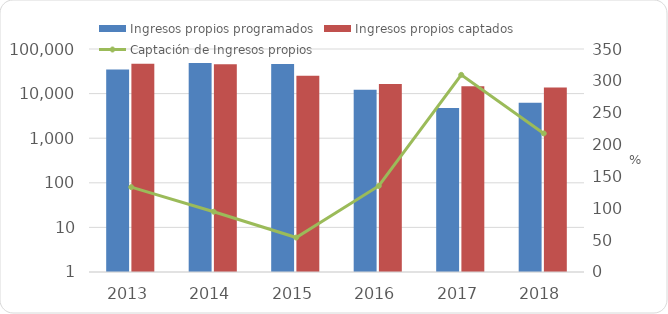
| Category | Ingresos propios programados | Ingresos propios captados  |
|---|---|---|
| 2013 | 34864.059 | 46445.785 |
| 2014 | 48309 | 45688 |
| 2015 | 46290.3 | 25037.4 |
| 2016 | 12228.112 | 16512.034 |
| 2017 | 4746.7 | 14685.3 |
| 2018 | 6263.7 | 13623.8 |